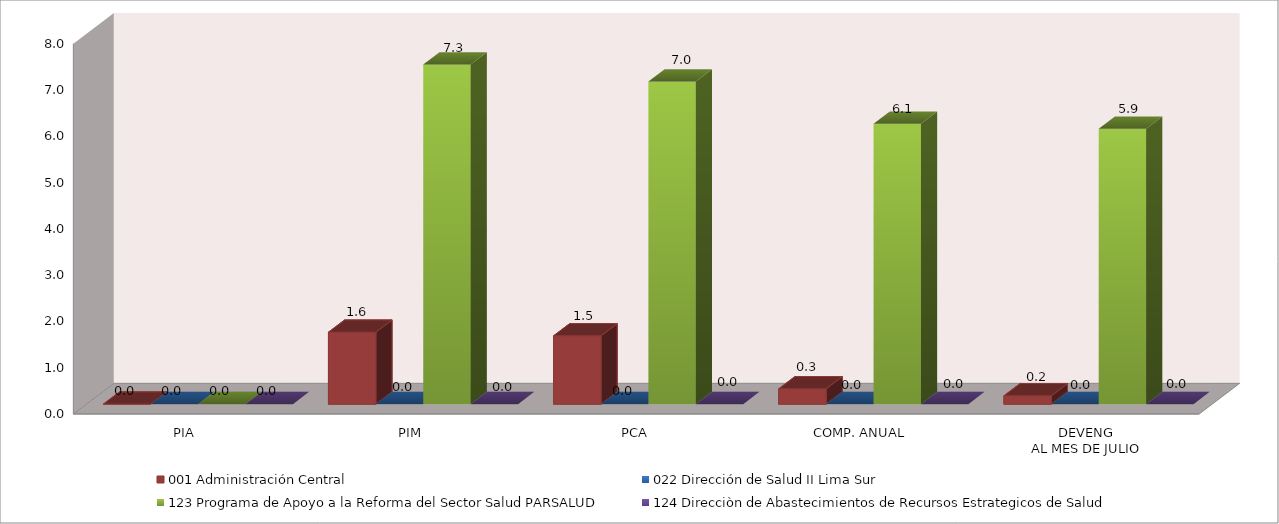
| Category | 001 Administración Central | 022 Dirección de Salud II Lima Sur | 123 Programa de Apoyo a la Reforma del Sector Salud PARSALUD | 124 Direcciòn de Abastecimientos de Recursos Estrategicos de Salud |
|---|---|---|---|---|
| PIA | 0 | 0 | 0 | 0 |
| PIM | 1.554 | 0.005 | 7.334 | 0 |
| PCA | 1.476 | 0.005 | 6.968 | 0 |
| COMP. ANUAL | 0.331 | 0.005 | 6.058 | 0 |
| DEVENG
AL MES DE JULIO | 0.18 | 0 | 5.949 | 0 |